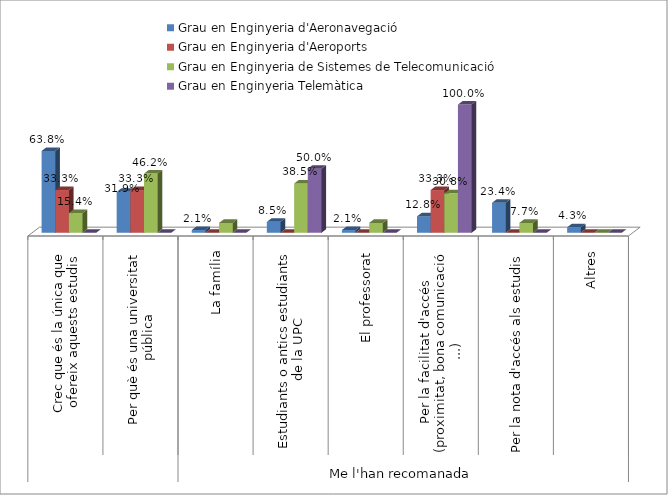
| Category | Grau en Enginyeria d'Aeronavegació | Grau en Enginyeria d'Aeroports | Grau en Enginyeria de Sistemes de Telecomunicació | Grau en Enginyeria Telemàtica |
|---|---|---|---|---|
| 0 | 0.638 | 0.333 | 0.154 | 0 |
| 1 | 0.319 | 0.333 | 0.462 | 0 |
| 2 | 0.021 | 0 | 0.077 | 0 |
| 3 | 0.085 | 0 | 0.385 | 0.5 |
| 4 | 0.021 | 0 | 0.077 | 0 |
| 5 | 0.128 | 0.333 | 0.308 | 1 |
| 6 | 0.234 | 0 | 0.077 | 0 |
| 7 | 0.043 | 0 | 0 | 0 |